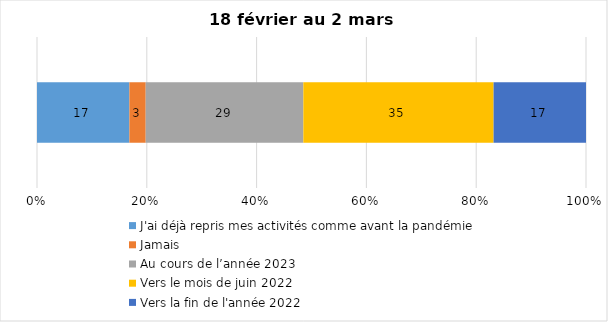
| Category | J'ai déjà repris mes activités comme avant la pandémie | Jamais | Au cours de l’année 2023 | Vers le mois de juin 2022 | Vers la fin de l'année 2022 |
|---|---|---|---|---|---|
| 0 | 17 | 3 | 29 | 35 | 17 |